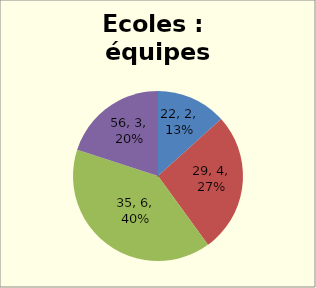
| Category | Ecoles |
|---|---|
| 22.0 | 2 |
| 29.0 | 4 |
| 35.0 | 6 |
| 56.0 | 3 |